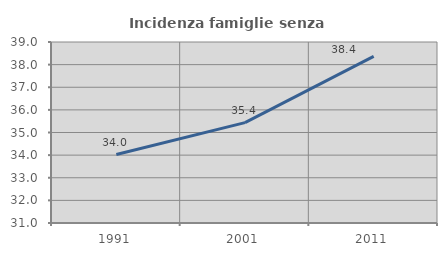
| Category | Incidenza famiglie senza nuclei |
|---|---|
| 1991.0 | 34.025 |
| 2001.0 | 35.436 |
| 2011.0 | 38.368 |